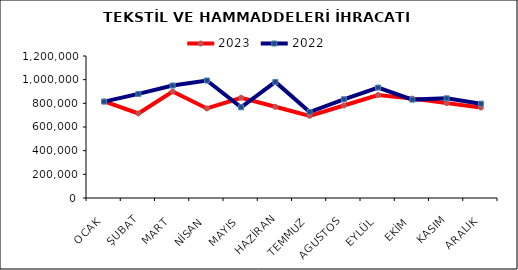
| Category | 2023 | 2022 |
|---|---|---|
| OCAK | 816022.563 | 814726.313 |
| ŞUBAT | 714732.623 | 879770.302 |
| MART | 900200.208 | 950762.142 |
| NİSAN | 756875.904 | 992808.343 |
| MAYIS | 847389.779 | 766269.236 |
| HAZİRAN | 770669.42 | 980776.993 |
| TEMMUZ | 694446.996 | 726344.147 |
| AGUSTOS | 781700.198 | 834283.214 |
| EYLÜL | 870575.644 | 933336.45 |
| EKİM | 839865.198 | 831448.668 |
| KASIM | 801621.464 | 842532.55 |
| ARALIK | 764346.82 | 797035.701 |